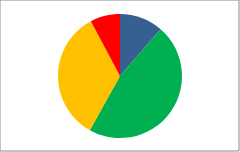
| Category | Series 0 | Series 1 |
|---|---|---|
| Outstanding | 19 | 0.114 |
| Good | 78 | 0.467 |
| RI | 57 | 0.341 |
| Inadequate | 13 | 0.078 |